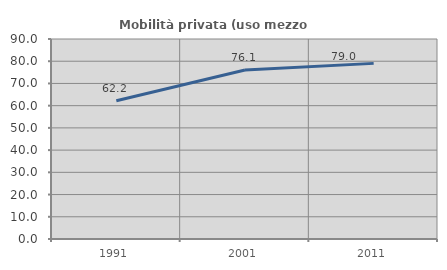
| Category | Mobilità privata (uso mezzo privato) |
|---|---|
| 1991.0 | 62.225 |
| 2001.0 | 76.052 |
| 2011.0 | 79.031 |